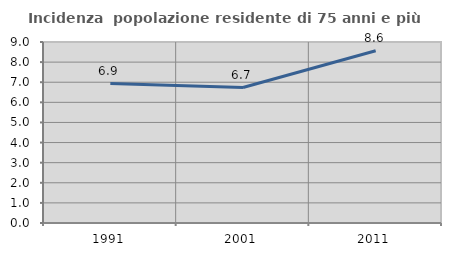
| Category | Incidenza  popolazione residente di 75 anni e più |
|---|---|
| 1991.0 | 6.934 |
| 2001.0 | 6.736 |
| 2011.0 | 8.566 |